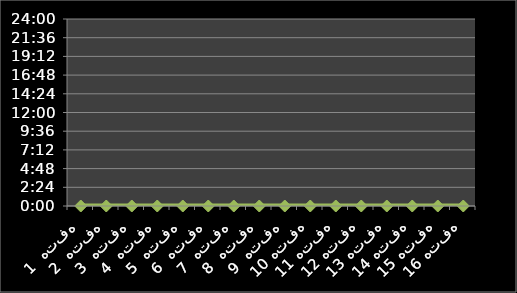
| Category | روند ساعات مطالعه هفتگی |
|---|---|
| هفته  1 | 0 |
| هفته  2 | 0 |
| هفته  3 | 0 |
| هفته  4 | 0 |
| هفته  5 | 0 |
| هفته  6 | 0 |
| هفته  7 | 0 |
| هفته  8 | 0 |
| هفته  9 | 0 |
| هفته 10 | 0 |
| هفته 11 | 0 |
| هفته 12 | 0 |
| هفته 13 | 0 |
| هفته 14 | 0 |
| هفته 15 | 0 |
| هفته 16 | 0 |